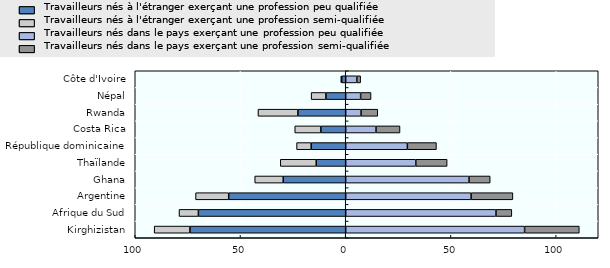
| Category | Travailleurs nés à l'étranger exerçant une profession peu qualifiée | Travailleurs nés à l'étranger exerçant une profession semi-qualifiée | Travailleurs nés dans le pays exerçant une profession peu qualifiée | Travailleurs nés dans le pays exerçant une profession semi-qualifiée |
|---|---|---|---|---|
| Kirghizistan | -74 | -17 | 85 | 26 |
| Afrique du Sud | -70 | -9.2 | 71.4 | 7.54 |
| Argentine | -55.6 | -15.74 | 59.6 | 19.84 |
| Ghana | -29.7 | -13.52 | 58.6 | 10.06 |
| Thaïlande | -14 | -17.08 | 33.3 | 14.9 |
| République dominicaine | -16.4 | -6.94 | 29.3 | 13.82 |
| Costa Rica | -11.8 | -12.4 | 14.4 | 11.4 |
| Rwanda | -22.7 | -18.984 | 7.3 | 7.94 |
| Népal | -9.4 | -7.02 | 7.1 | 4.94 |
| Côte d'Ivoire | -1.9 | -0.4 | 5.3 | 1.8 |